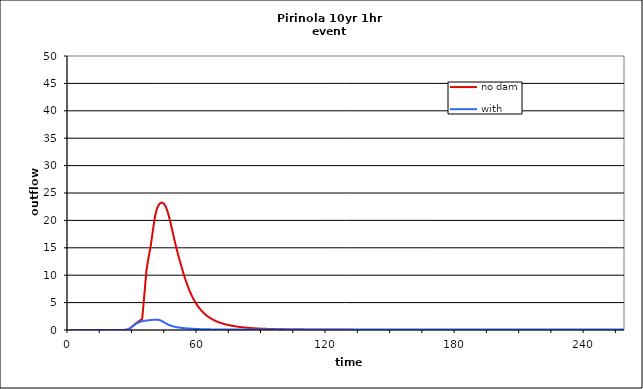
| Category | no dam | with dam |
|---|---|---|
| 0.0 | 0 | 0 |
| 1.0 | 0 | 0 |
| 2.0 | 0 | 0 |
| 3.0 | 0 | 0 |
| 4.0 | 0 | 0 |
| 5.0 | 0 | 0 |
| 6.0 | 0 | 0 |
| 7.0 | 0 | 0 |
| 8.0 | 0 | 0 |
| 9.0 | 0 | 0 |
| 10.0 | 0 | 0 |
| 11.0 | 0 | 0 |
| 12.0 | 0 | 0 |
| 13.0 | 0 | 0 |
| 14.0 | 0 | 0 |
| 15.0 | 0 | 0 |
| 16.0 | 0 | 0 |
| 17.0 | 0 | 0 |
| 18.0 | 0 | 0 |
| 19.0 | 0 | 0 |
| 20.0 | 0 | 0 |
| 21.0 | 0 | 0 |
| 22.0 | 0 | 0 |
| 23.0 | 0.001 | 0.001 |
| 24.0 | 0.004 | 0.004 |
| 25.0 | 0.01 | 0.01 |
| 26.0 | 0.024 | 0.024 |
| 27.0 | 0.047 | 0.048 |
| 28.0 | 0.219 | 0.206 |
| 29.0 | 0.518 | 0.492 |
| 30.0 | 0.862 | 0.822 |
| 31.0 | 1.175 | 1.098 |
| 32.0 | 1.459 | 1.321 |
| 33.0 | 1.746 | 1.482 |
| 34.0 | 2.017 | 1.591 |
| 35.0 | 6.41 | 1.67 |
| 36.0 | 10.948 | 1.73 |
| 37.0 | 13.325 | 1.778 |
| 38.0 | 15.437 | 1.819 |
| 39.0 | 18.222 | 1.854 |
| 40.0 | 20.827 | 1.886 |
| 41.0 | 22.321 | 1.892 |
| 42.0 | 23.015 | 1.818 |
| 43.0 | 23.258 | 1.664 |
| 44.0 | 23.111 | 1.445 |
| 45.0 | 22.496 | 1.208 |
| 46.0 | 21.374 | 1 |
| 47.0 | 19.863 | 0.835 |
| 48.0 | 18.163 | 0.705 |
| 49.0 | 16.441 | 0.601 |
| 50.0 | 14.82 | 0.519 |
| 51.0 | 13.322 | 0.453 |
| 52.0 | 11.908 | 0.4 |
| 53.0 | 10.573 | 0.357 |
| 54.0 | 9.33 | 0.32 |
| 55.0 | 8.201 | 0.287 |
| 56.0 | 7.19 | 0.258 |
| 57.0 | 6.304 | 0.233 |
| 58.0 | 5.528 | 0.21 |
| 59.0 | 4.857 | 0.19 |
| 60.0 | 4.275 | 0.173 |
| 61.0 | 3.774 | 0.158 |
| 62.0 | 3.34 | 0.146 |
| 63.0 | 2.963 | 0.135 |
| 64.0 | 2.632 | 0.126 |
| 65.0 | 2.345 | 0.118 |
| 66.0 | 2.091 | 0.111 |
| 67.0 | 1.869 | 0.105 |
| 68.0 | 1.676 | 0.099 |
| 69.0 | 1.507 | 0.095 |
| 70.0 | 1.357 | 0.092 |
| 71.0 | 1.226 | 0.089 |
| 72.0 | 1.11 | 0.087 |
| 73.0 | 1.008 | 0.086 |
| 74.0 | 0.916 | 0.085 |
| 75.0 | 0.832 | 0.084 |
| 76.0 | 0.757 | 0.083 |
| 77.0 | 0.688 | 0.082 |
| 78.0 | 0.626 | 0.082 |
| 79.0 | 0.57 | 0.081 |
| 80.0 | 0.52 | 0.081 |
| 81.0 | 0.476 | 0.08 |
| 82.0 | 0.437 | 0.08 |
| 83.0 | 0.402 | 0.08 |
| 84.0 | 0.37 | 0.079 |
| 85.0 | 0.342 | 0.079 |
| 86.0 | 0.316 | 0.079 |
| 87.0 | 0.292 | 0.079 |
| 88.0 | 0.271 | 0.079 |
| 89.0 | 0.251 | 0.078 |
| 90.0 | 0.234 | 0.078 |
| 91.0 | 0.217 | 0.078 |
| 92.0 | 0.202 | 0.078 |
| 93.0 | 0.189 | 0.078 |
| 94.0 | 0.176 | 0.078 |
| 95.0 | 0.165 | 0.078 |
| 96.0 | 0.154 | 0.078 |
| 97.0 | 0.144 | 0.078 |
| 98.0 | 0.135 | 0.078 |
| 99.0 | 0.127 | 0.078 |
| 100.0 | 0.119 | 0.078 |
| 101.0 | 0.112 | 0.078 |
| 102.0 | 0.105 | 0.078 |
| 103.0 | 0.099 | 0.078 |
| 104.0 | 0.094 | 0.078 |
| 105.0 | 0.088 | 0.078 |
| 106.0 | 0.083 | 0.078 |
| 107.0 | 0.079 | 0.078 |
| 108.0 | 0.074 | 0.078 |
| 109.0 | 0.07 | 0.078 |
| 110.0 | 0.067 | 0.078 |
| 111.0 | 0.063 | 0.078 |
| 112.0 | 0.06 | 0.078 |
| 113.0 | 0.057 | 0.078 |
| 114.0 | 0.054 | 0.078 |
| 115.0 | 0.051 | 0.078 |
| 116.0 | 0.048 | 0.078 |
| 117.0 | 0.046 | 0.078 |
| 118.0 | 0.044 | 0.078 |
| 119.0 | 0.041 | 0.078 |
| 120.0 | 0.039 | 0.078 |
| 121.0 | 0.037 | 0.078 |
| 122.0 | 0.036 | 0.078 |
| 123.0 | 0.034 | 0.078 |
| 124.0 | 0.032 | 0.078 |
| 125.0 | 0.031 | 0.078 |
| 126.0 | 0.029 | 0.078 |
| 127.0 | 0.028 | 0.078 |
| 128.0 | 0.027 | 0.078 |
| 129.0 | 0.026 | 0.078 |
| 130.0 | 0.024 | 0.078 |
| 131.0 | 0.023 | 0.078 |
| 132.0 | 0.022 | 0.078 |
| 133.0 | 0.021 | 0.078 |
| 134.0 | 0.02 | 0.078 |
| 135.0 | 0.019 | 0.078 |
| 136.0 | 0.019 | 0.078 |
| 137.0 | 0.018 | 0.078 |
| 138.0 | 0.017 | 0.078 |
| 139.0 | 0.016 | 0.078 |
| 140.0 | 0.016 | 0.078 |
| 141.0 | 0.015 | 0.078 |
| 142.0 | 0.014 | 0.078 |
| 143.0 | 0.014 | 0.078 |
| 144.0 | 0.013 | 0.078 |
| 145.0 | 0.013 | 0.078 |
| 146.0 | 0.012 | 0.078 |
| 147.0 | 0.012 | 0.078 |
| 148.0 | 0.011 | 0.078 |
| 149.0 | 0.011 | 0.078 |
| 150.0 | 0.01 | 0.078 |
| 151.0 | 0.01 | 0.078 |
| 152.0 | 0.009 | 0.078 |
| 153.0 | 0.009 | 0.078 |
| 154.0 | 0.008 | 0.078 |
| 155.0 | 0.008 | 0.078 |
| 156.0 | 0.008 | 0.078 |
| 157.0 | 0.007 | 0.078 |
| 158.0 | 0.007 | 0.078 |
| 159.0 | 0.007 | 0.078 |
| 160.0 | 0.006 | 0.078 |
| 161.0 | 0.006 | 0.078 |
| 162.0 | 0.006 | 0.078 |
| 163.0 | 0.006 | 0.078 |
| 164.0 | 0.005 | 0.078 |
| 165.0 | 0.005 | 0.078 |
| 166.0 | 0.005 | 0.078 |
| 167.0 | 0.005 | 0.078 |
| 168.0 | 0.004 | 0.078 |
| 169.0 | 0.004 | 0.078 |
| 170.0 | 0.004 | 0.078 |
| 171.0 | 0.004 | 0.078 |
| 172.0 | 0.004 | 0.078 |
| 173.0 | 0.003 | 0.078 |
| 174.0 | 0.003 | 0.078 |
| 175.0 | 0.003 | 0.078 |
| 176.0 | 0.003 | 0.078 |
| 177.0 | 0.003 | 0.078 |
| 178.0 | 0.002 | 0.078 |
| 179.0 | 0.002 | 0.078 |
| 180.0 | 0.002 | 0.078 |
| 181.0 | 0.002 | 0.078 |
| 182.0 | 0.002 | 0.078 |
| 183.0 | 0.002 | 0.078 |
| 184.0 | 0.002 | 0.078 |
| 185.0 | 0.002 | 0.078 |
| 186.0 | 0.001 | 0.078 |
| 187.0 | 0.001 | 0.078 |
| 188.0 | 0.001 | 0.078 |
| 189.0 | 0.001 | 0.078 |
| 190.0 | 0.001 | 0.078 |
| 191.0 | 0.001 | 0.078 |
| 192.0 | 0.001 | 0.078 |
| 193.0 | 0.001 | 0.078 |
| 194.0 | 0.001 | 0.078 |
| 195.0 | 0.001 | 0.078 |
| 196.0 | 0.001 | 0.078 |
| 197.0 | 0.001 | 0.078 |
| 198.0 | 0.001 | 0.078 |
| 199.0 | 0.001 | 0.078 |
| 200.0 | 0.001 | 0.078 |
| 201.0 | 0.001 | 0.078 |
| 202.0 | 0 | 0.078 |
| 203.0 | 0 | 0.078 |
| 204.0 | 0 | 0.078 |
| 205.0 | 0 | 0.078 |
| 206.0 | 0 | 0.078 |
| 207.0 | 0 | 0.078 |
| 208.0 | 0 | 0.078 |
| 209.0 | 0 | 0.078 |
| 210.0 | 0 | 0.078 |
| 211.0 | 0 | 0.078 |
| 212.0 | 0 | 0.078 |
| 213.0 | 0 | 0.078 |
| 214.0 | 0 | 0.078 |
| 215.0 | 0 | 0.078 |
| 216.0 | 0 | 0.078 |
| 217.0 | 0 | 0.078 |
| 218.0 | 0 | 0.078 |
| 219.0 | 0 | 0.078 |
| 220.0 | 0 | 0.078 |
| 221.0 | 0 | 0.078 |
| 222.0 | 0 | 0.078 |
| 223.0 | 0 | 0.078 |
| 224.0 | 0 | 0.078 |
| 225.0 | 0 | 0.078 |
| 226.0 | 0 | 0.078 |
| 227.0 | 0 | 0.078 |
| 228.0 | 0 | 0.078 |
| 229.0 | 0 | 0.078 |
| 230.0 | 0 | 0.078 |
| 231.0 | 0 | 0.078 |
| 232.0 | 0 | 0.078 |
| 233.0 | 0 | 0.078 |
| 234.0 | 0 | 0.078 |
| 235.0 | 0 | 0.078 |
| 236.0 | 0 | 0.078 |
| 237.0 | 0 | 0.078 |
| 238.0 | 0 | 0.078 |
| 239.0 | 0 | 0.078 |
| 240.0 | 0 | 0.078 |
| 241.0 | 0 | 0.078 |
| 242.0 | 0 | 0.077 |
| 243.0 | 0 | 0.077 |
| 244.0 | 0 | 0.077 |
| 245.0 | 0 | 0.077 |
| 246.0 | 0 | 0.077 |
| 247.0 | 0 | 0.077 |
| 248.0 | 0 | 0.077 |
| 249.0 | 0 | 0.077 |
| 250.0 | 0 | 0.077 |
| 251.0 | 0 | 0.077 |
| 252.0 | 0 | 0.077 |
| 253.0 | 0 | 0.077 |
| 254.0 | 0 | 0.077 |
| 255.0 | 0 | 0.077 |
| 256.0 | 0 | 0.077 |
| 257.0 | 0 | 0.077 |
| 258.0 | 0 | 0.077 |